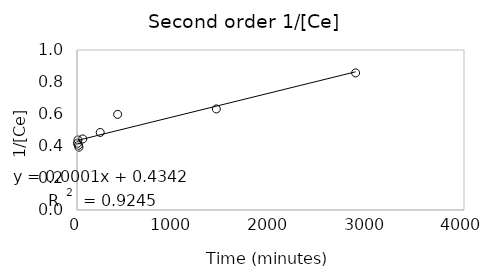
| Category | Second order 1/[Ce] |
|---|---|
| 5.0 | 0.417 |
| 10.0 | 0.438 |
| 15.0 | 0.404 |
| 20.0 | 0.393 |
| 60.0 | 0.444 |
| 240.0 | 0.485 |
| 420.0 | 0.598 |
| 1440.0 | 0.632 |
| 2880.0 | 0.857 |